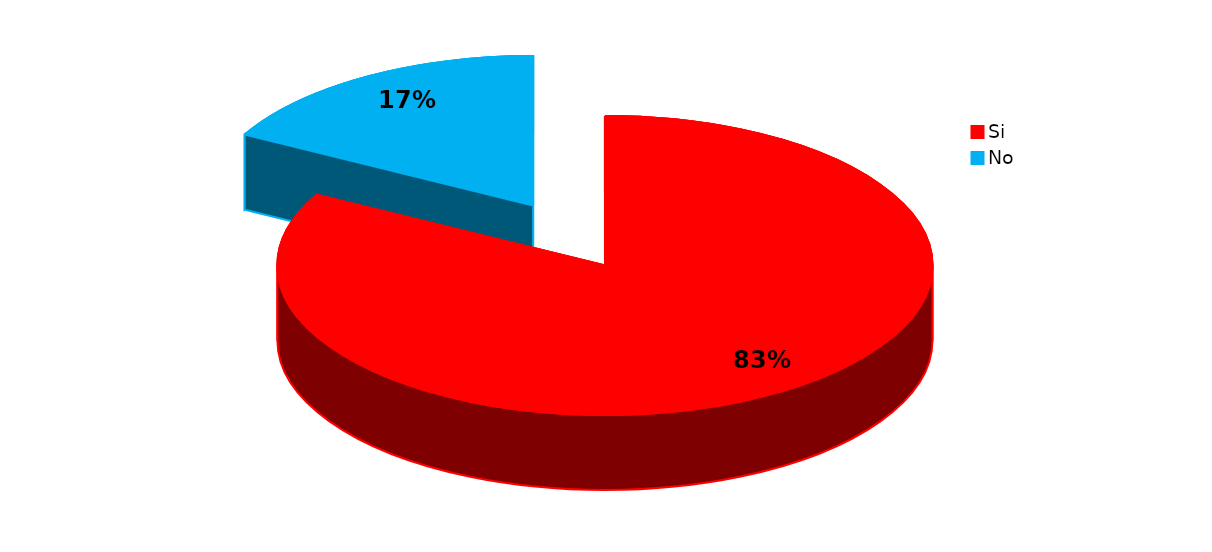
| Category | Series 0 |
|---|---|
| Si | 58 |
| No | 12 |